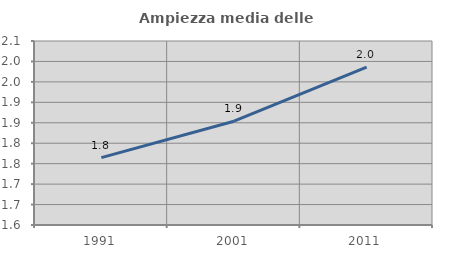
| Category | Ampiezza media delle famiglie |
|---|---|
| 1991.0 | 1.765 |
| 2001.0 | 1.854 |
| 2011.0 | 1.986 |